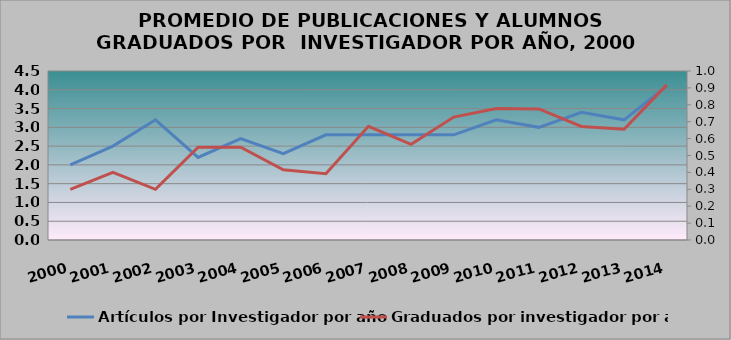
| Category | Artículos por Investigador por año |
|---|---|
| 2000.0 | 2 |
| 2001.0 | 2.5 |
| 2002.0 | 3.2 |
| 2003.0 | 2.2 |
| 2004.0 | 2.7 |
| 2005.0 | 2.3 |
| 2006.0 | 2.8 |
| 2007.0 | 2.8 |
| 2008.0 | 2.8 |
| 2009.0 | 2.8 |
| 2010.0 | 3.2 |
| 2011.0 | 3 |
| 2012.0 | 3.4 |
| 2013.0 | 3.2 |
| 2014.0 | 4.1 |